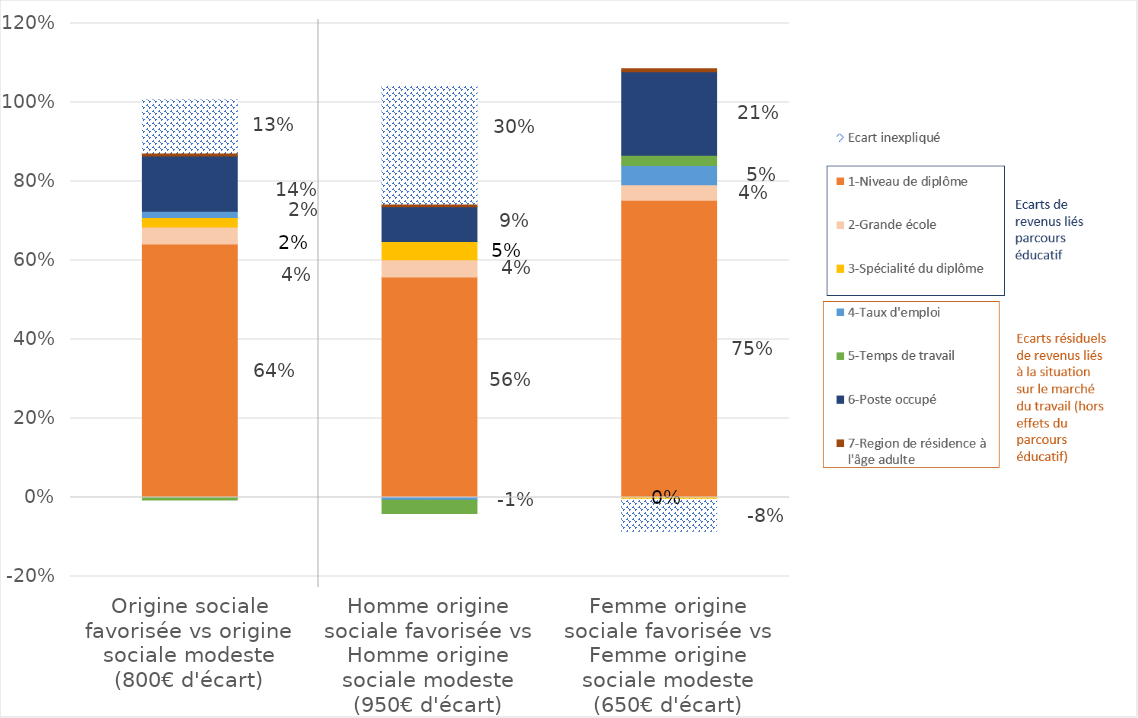
| Category | 1-Niveau de diplôme | 2-Grande école | 3-Spécialité du diplôme | 4-Taux d'emploi | 5-Temps de travail | 6-Poste occupé | 7-Region de résidence | Ecart inexpliqué |
|---|---|---|---|---|---|---|---|---|
| Origine sociale favorisée vs origine sociale modeste (800€ d'écart) | 0.642 | 0.043 | 0.024 | 0.016 | -0.006 | 0.14 | 0.008 | 0.134 |
| Homme origine sociale favorisée vs Homme origine sociale modeste (950€ d'écart) | 0.558 | 0.044 | 0.046 | -0.007 | -0.034 | 0.088 | 0.007 | 0.297 |
| Femme origine sociale favorisée vs Femme origine sociale modeste (650€ d'écart) | 0.752 | 0.039 | -0.005 | 0.049 | 0.026 | 0.212 | 0.007 | -0.081 |